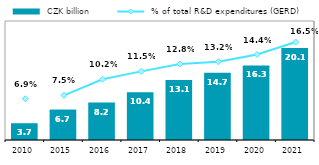
| Category |  CZK billion |
|---|---|
| 2010.0 | 3.664 |
| 2015.0 | 6.651 |
| 2016.0 | 8.182 |
| 2017.0 | 10.424 |
| 2018.0 | 13.125 |
| 2019.0 | 14.683 |
| 2020.0 | 16.284 |
| 2021.0 | 20.078 |